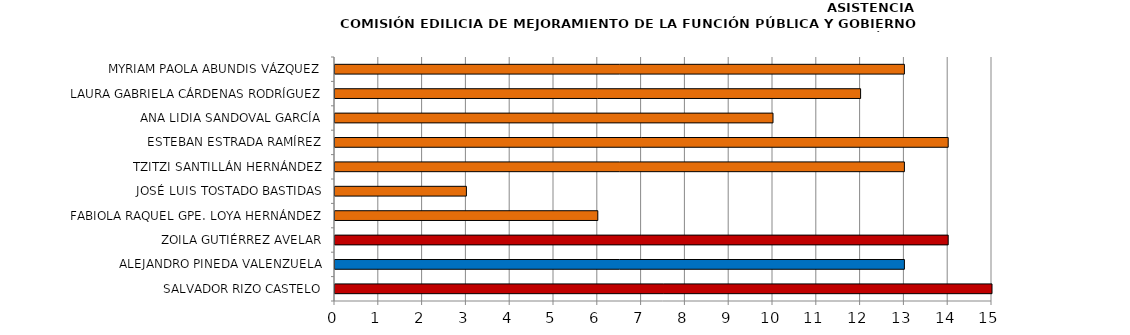
| Category | Series 0 |
|---|---|
| SALVADOR RIZO CASTELO | 15 |
| ALEJANDRO PINEDA VALENZUELA | 13 |
| ZOILA GUTIÉRREZ AVELAR | 14 |
| FABIOLA RAQUEL GPE. LOYA HERNÁNDEZ | 6 |
| JOSÉ LUIS TOSTADO BASTIDAS | 3 |
| TZITZI SANTILLÁN HERNÁNDEZ | 13 |
| ESTEBAN ESTRADA RAMÍREZ | 14 |
| ANA LIDIA SANDOVAL GARCÍA | 10 |
| LAURA GABRIELA CÁRDENAS RODRÍGUEZ | 12 |
| MYRIAM PAOLA ABUNDIS VÁZQUEZ | 13 |